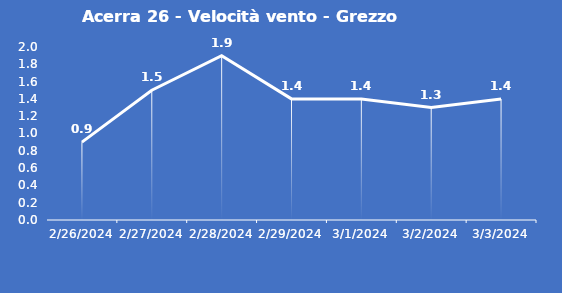
| Category | Acerra 26 - Velocità vento - Grezzo (m/s) |
|---|---|
| 2/26/24 | 0.9 |
| 2/27/24 | 1.5 |
| 2/28/24 | 1.9 |
| 2/29/24 | 1.4 |
| 3/1/24 | 1.4 |
| 3/2/24 | 1.3 |
| 3/3/24 | 1.4 |